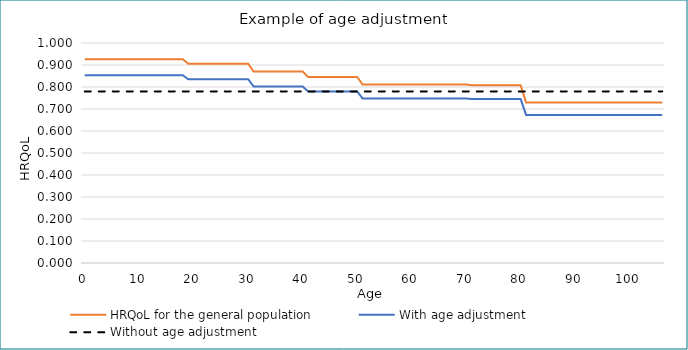
| Category | HRQoL for the general population | With age adjustment | Without age adjustment |
|---|---|---|---|
| 0.0 | 0.926 | 0.854 | 0.78 |
| 1.0 | 0.926 | 0.854 | 0.78 |
| 2.0 | 0.926 | 0.854 | 0.78 |
| 3.0 | 0.926 | 0.854 | 0.78 |
| 4.0 | 0.926 | 0.854 | 0.78 |
| 5.0 | 0.926 | 0.854 | 0.78 |
| 6.0 | 0.926 | 0.854 | 0.78 |
| 7.0 | 0.926 | 0.854 | 0.78 |
| 8.0 | 0.926 | 0.854 | 0.78 |
| 9.0 | 0.926 | 0.854 | 0.78 |
| 10.0 | 0.926 | 0.854 | 0.78 |
| 11.0 | 0.926 | 0.854 | 0.78 |
| 12.0 | 0.926 | 0.854 | 0.78 |
| 13.0 | 0.926 | 0.854 | 0.78 |
| 14.0 | 0.926 | 0.854 | 0.78 |
| 15.0 | 0.926 | 0.854 | 0.78 |
| 16.0 | 0.926 | 0.854 | 0.78 |
| 17.0 | 0.926 | 0.854 | 0.78 |
| 18.0 | 0.926 | 0.854 | 0.78 |
| 19.0 | 0.906 | 0.835 | 0.78 |
| 20.0 | 0.906 | 0.835 | 0.78 |
| 21.0 | 0.906 | 0.835 | 0.78 |
| 22.0 | 0.906 | 0.835 | 0.78 |
| 23.0 | 0.906 | 0.835 | 0.78 |
| 24.0 | 0.906 | 0.835 | 0.78 |
| 25.0 | 0.906 | 0.835 | 0.78 |
| 26.0 | 0.906 | 0.835 | 0.78 |
| 27.0 | 0.906 | 0.835 | 0.78 |
| 28.0 | 0.906 | 0.835 | 0.78 |
| 29.0 | 0.906 | 0.835 | 0.78 |
| 30.0 | 0.906 | 0.835 | 0.78 |
| 31.0 | 0.87 | 0.802 | 0.78 |
| 32.0 | 0.87 | 0.802 | 0.78 |
| 33.0 | 0.87 | 0.802 | 0.78 |
| 34.0 | 0.87 | 0.802 | 0.78 |
| 35.0 | 0.87 | 0.802 | 0.78 |
| 36.0 | 0.87 | 0.802 | 0.78 |
| 37.0 | 0.87 | 0.802 | 0.78 |
| 38.0 | 0.87 | 0.802 | 0.78 |
| 39.0 | 0.87 | 0.802 | 0.78 |
| 40.0 | 0.87 | 0.802 | 0.78 |
| 41.0 | 0.846 | 0.78 | 0.78 |
| 42.0 | 0.846 | 0.78 | 0.78 |
| 43.0 | 0.846 | 0.78 | 0.78 |
| 44.0 | 0.846 | 0.78 | 0.78 |
| 45.0 | 0.846 | 0.78 | 0.78 |
| 46.0 | 0.846 | 0.78 | 0.78 |
| 47.0 | 0.846 | 0.78 | 0.78 |
| 48.0 | 0.846 | 0.78 | 0.78 |
| 49.0 | 0.846 | 0.78 | 0.78 |
| 50.0 | 0.846 | 0.78 | 0.78 |
| 51.0 | 0.811 | 0.748 | 0.78 |
| 52.0 | 0.811 | 0.748 | 0.78 |
| 53.0 | 0.811 | 0.748 | 0.78 |
| 54.0 | 0.811 | 0.748 | 0.78 |
| 55.0 | 0.811 | 0.748 | 0.78 |
| 56.0 | 0.811 | 0.748 | 0.78 |
| 57.0 | 0.811 | 0.748 | 0.78 |
| 58.0 | 0.811 | 0.748 | 0.78 |
| 59.0 | 0.811 | 0.748 | 0.78 |
| 60.0 | 0.811 | 0.748 | 0.78 |
| 61.0 | 0.811 | 0.748 | 0.78 |
| 62.0 | 0.811 | 0.748 | 0.78 |
| 63.0 | 0.811 | 0.748 | 0.78 |
| 64.0 | 0.811 | 0.748 | 0.78 |
| 65.0 | 0.811 | 0.748 | 0.78 |
| 66.0 | 0.811 | 0.748 | 0.78 |
| 67.0 | 0.811 | 0.748 | 0.78 |
| 68.0 | 0.811 | 0.748 | 0.78 |
| 69.0 | 0.811 | 0.748 | 0.78 |
| 70.0 | 0.811 | 0.748 | 0.78 |
| 71.0 | 0.808 | 0.745 | 0.78 |
| 72.0 | 0.808 | 0.745 | 0.78 |
| 73.0 | 0.808 | 0.745 | 0.78 |
| 74.0 | 0.808 | 0.745 | 0.78 |
| 75.0 | 0.808 | 0.745 | 0.78 |
| 76.0 | 0.808 | 0.745 | 0.78 |
| 77.0 | 0.808 | 0.745 | 0.78 |
| 78.0 | 0.808 | 0.745 | 0.78 |
| 79.0 | 0.808 | 0.745 | 0.78 |
| 80.0 | 0.808 | 0.745 | 0.78 |
| 81.0 | 0.73 | 0.673 | 0.78 |
| 82.0 | 0.73 | 0.673 | 0.78 |
| 83.0 | 0.73 | 0.673 | 0.78 |
| 84.0 | 0.73 | 0.673 | 0.78 |
| 85.0 | 0.73 | 0.673 | 0.78 |
| 86.0 | 0.73 | 0.673 | 0.78 |
| 87.0 | 0.73 | 0.673 | 0.78 |
| 88.0 | 0.73 | 0.673 | 0.78 |
| 89.0 | 0.73 | 0.673 | 0.78 |
| 90.0 | 0.73 | 0.673 | 0.78 |
| 91.0 | 0.73 | 0.673 | 0.78 |
| 92.0 | 0.73 | 0.673 | 0.78 |
| 93.0 | 0.73 | 0.673 | 0.78 |
| 94.0 | 0.73 | 0.673 | 0.78 |
| 95.0 | 0.73 | 0.673 | 0.78 |
| 96.0 | 0.73 | 0.673 | 0.78 |
| 97.0 | 0.73 | 0.673 | 0.78 |
| 98.0 | 0.73 | 0.673 | 0.78 |
| 99.0 | 0.73 | 0.673 | 0.78 |
| 100.0 | 0.73 | 0.673 | 0.78 |
| 101.0 | 0.73 | 0.673 | 0.78 |
| 102.0 | 0.73 | 0.673 | 0.78 |
| 103.0 | 0.73 | 0.673 | 0.78 |
| 104.0 | 0.73 | 0.673 | 0.78 |
| 105.0 | 0.73 | 0.673 | 0.78 |
| 106.0 | 0.73 | 0.673 | 0.78 |